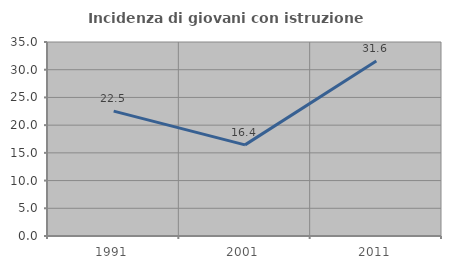
| Category | Incidenza di giovani con istruzione universitaria |
|---|---|
| 1991.0 | 22.535 |
| 2001.0 | 16.438 |
| 2011.0 | 31.579 |